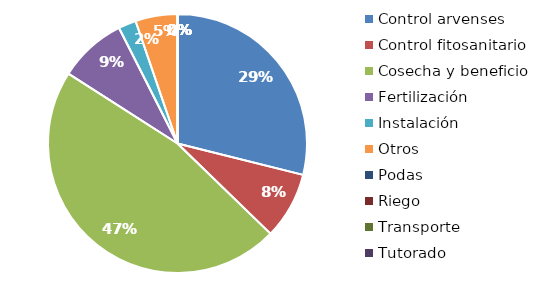
| Category | Valor |
|---|---|
| Control arvenses | 10014666.667 |
| Control fitosanitario | 2898000 |
| Cosecha y beneficio | 16222326.001 |
| Fertilización | 2940000 |
| Instalación | 765333.333 |
| Otros | 1820000 |
| Podas | 0 |
| Riego | 0 |
| Transporte | 0 |
| Tutorado | 0 |